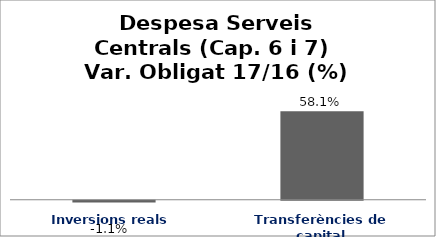
| Category | Series 0 |
|---|---|
| Inversions reals | -0.011 |
| Transferències de capital | 0.581 |